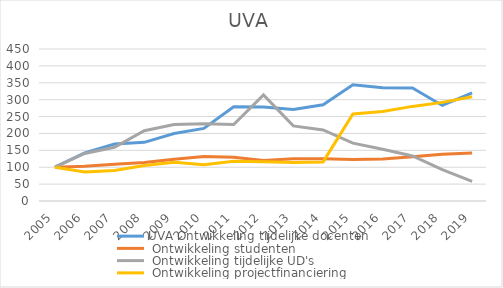
| Category | UVA |
|---|---|
| 2005.0 | 100 |
| 2006.0 | 85.627 |
| 2007.0 | 90.049 |
| 2008.0 | 105.143 |
| 2009.0 | 114.899 |
| 2010.0 | 107.439 |
| 2011.0 | 117.684 |
| 2012.0 | 116.339 |
| 2013.0 | 113.759 |
| 2014.0 | 115.725 |
| 2015.0 | 257.617 |
| 2016.0 | 264.988 |
| 2017.0 | 280.098 |
| 2018.0 | 292.015 |
| 2019.0 | 308.722 |